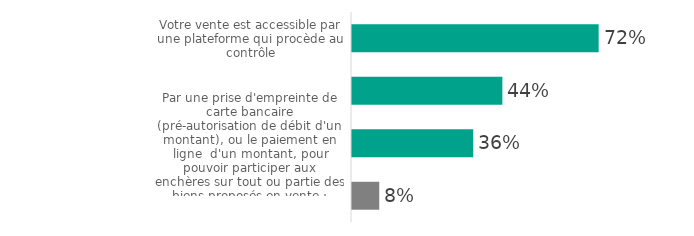
| Category | Series 0 |
|---|---|
| Votre vente est accessible par une plateforme qui procède au contrôle | 72.329 |
| Par des contrôles préalables à la vente (consultation d'un fichier des impayés ; transaction test pour vérifier les données du moyen de paiement à distance..) | 44.095 |
| Par une prise d'empreinte de carte bancaire (pré-autorisation de débit d'un montant), ou le paiement en ligne  d'un montant, pour pouvoir participer aux enchères sur tout ou partie des biens proposés en vente ; | 35.557 |
| Autre | 7.988 |